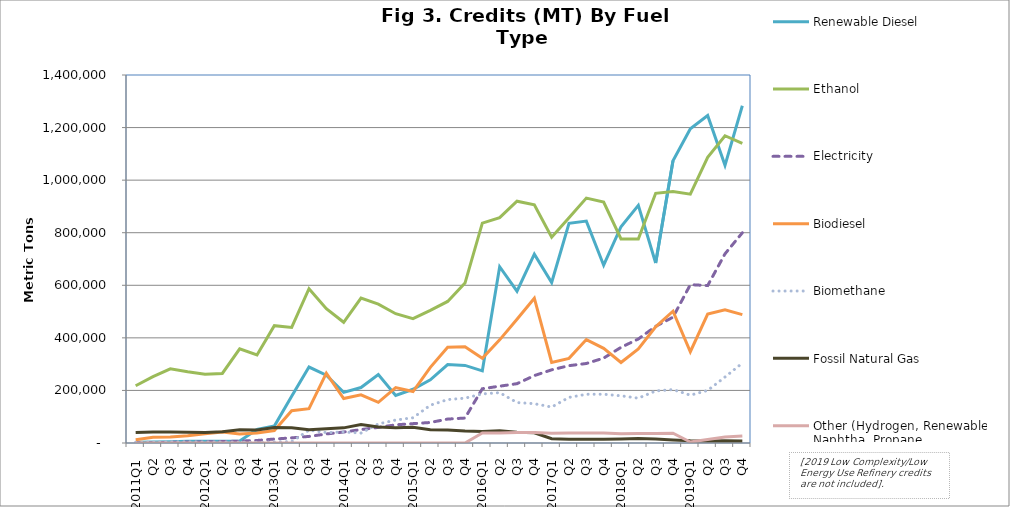
| Category | Renewable Diesel  | Ethanol | Electricity | Biodiesel | Biomethane | Fossil Natural Gas | Other (Hydrogen, Renewable Naphtha, Propane, Innovative Crude & Low Complexity / Low Energy Use Refining, etc.) |
|---|---|---|---|---|---|---|---|
| 2011Q1 | 3070 | 217913 | 459 | 12300 | 2212 | 39934 | 0 |
| Q2 | 3368 | 252550 | 1293 | 21555 | 3069 | 42169 | 0 |
| Q3 | 4362 | 282189 | 2455 | 22424 | 4960 | 41443 | 0 |
| Q4 | 6220 | 270901 | 3536 | 27988 | 4474 | 40844 | 0 |
| 2012Q1 | 6701 | 261269 | 4519 | 35382 | 4367 | 40226 | 0 |
| Q2 | 6804 | 264615 | 5560 | 41919 | 4221 | 43158 | 0 |
| Q3 | 7938 | 358459 | 7294 | 34052 | 3577 | 49942 | 0 |
| Q4 | 51216 | 334751 | 9611 | 37994 | 2680 | 49844 | 0 |
| 2013Q1 | 64445 | 446344 | 15051 | 47386 | 4240 | 59246 | 0 |
| Q2 | 178293 | 439633 | 19516 | 123072 | 5183 | 58045 | 0 |
| Q3 | 288998 | 586902 | 25039 | 130475 | 49133 | 50799 | 0 |
| Q4 | 258193 | 510999 | 34347 | 265737 | 39562 | 53765 | 0 |
| 2014Q1 | 192407 | 459238 | 41753 | 169218 | 41739 | 57641 | 0 |
| Q2 | 211004 | 551332 | 51092 | 183308 | 37894 | 70355 | 0 |
| Q3 | 260522 | 528433 | 59366 | 154934 | 72586 | 60793 | 0 |
| Q4 | 181046 | 491880 | 69119 | 210540 | 87339 | 58227 | 0 |
| 2015Q1 | 204352 | 473209 | 73708 | 195615 | 95988 | 59759 | 0 |
| Q2 | 240167 | 504542 | 78072 | 287973 | 143767 | 50798 | 0 |
| Q3 | 298591 | 538519 | 91036 | 364501 | 165250 | 49738 | 50 |
| Q4 | 295061 | 608484 | 94924 | 365821 | 170608 | 45811 | 24 |
| 2016Q1 | 274568 | 836629 | 206464 | 322607 | 186692 | 43789 | 37975 |
| Q2 | 670559 | 857168 | 216149 | 392318 | 191536 | 46764 | 38243 |
| Q3 | 577586 | 919750 | 225640 | 470922 | 153853 | 41125 | 39843 |
| Q4 | 718504 | 905839 | 256450 | 550936 | 149608 | 39072 | 39493 |
| 2017Q1 | 610652 | 783039 | 278442 | 306640 | 136721 | 16031 | 37028 |
| Q2 | 835625 | 856950 | 294201 | 321909 | 173497 | 14323 | 37617 |
| Q3 | 844159 | 931601 | 302457 | 393587 | 185321 | 14005 | 37717 |
| Q4 | 676294 | 916634 | 323014 | 359942 | 185446 | 14135 | 37644 |
| 2018Q1 | 822711 | 776336 | 363841 | 306337 | 179507 | 15292 | 35569 |
| Q2 | 904125 | 775942 | 395708 | 357508 | 170495 | 16964 | 36090 |
| Q3 | 684773 | 949941 | 443790 | 442007 | 197971 | 14909 | 36240 |
| Q4 | 1073782 | 956765 | 478635 | 501294 | 203315 | 11610 | 37400 |
| 2019Q1 | 1195556 | 946616 | 602432 | 347140 | 181925 | 8133 | 3903 |
| Q2 | 1245746 | 1086445 | 598816 | 490163 | 199923 | 7175 | 13357 |
| Q3 | 1056305 | 1168961 | 719705 | 506350 | 251078 | 8104 | 22683 |
| Q4 | 1282920 | 1139746 | 799764 | 488183 | 303885 | 7391 | 26511 |